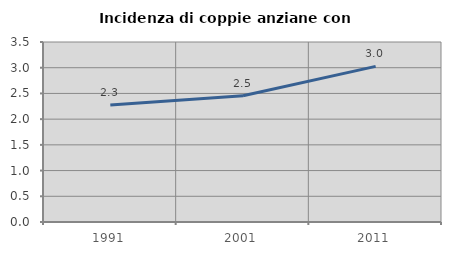
| Category | Incidenza di coppie anziane con figli |
|---|---|
| 1991.0 | 2.277 |
| 2001.0 | 2.455 |
| 2011.0 | 3.026 |